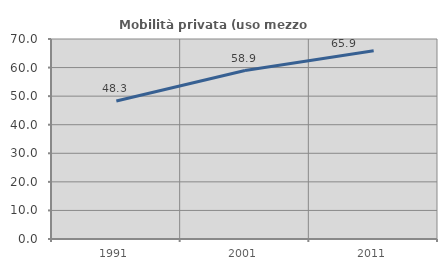
| Category | Mobilità privata (uso mezzo privato) |
|---|---|
| 1991.0 | 48.273 |
| 2001.0 | 58.946 |
| 2011.0 | 65.878 |